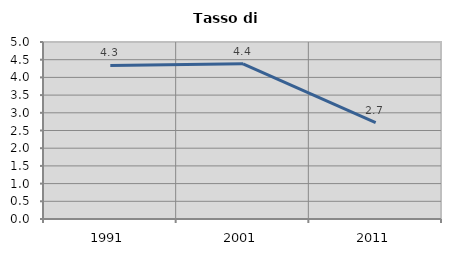
| Category | Tasso di disoccupazione   |
|---|---|
| 1991.0 | 4.338 |
| 2001.0 | 4.384 |
| 2011.0 | 2.725 |